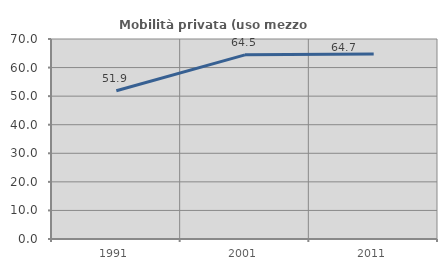
| Category | Mobilità privata (uso mezzo privato) |
|---|---|
| 1991.0 | 51.879 |
| 2001.0 | 64.461 |
| 2011.0 | 64.709 |